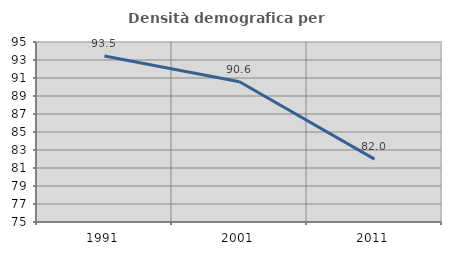
| Category | Densità demografica |
|---|---|
| 1991.0 | 93.455 |
| 2001.0 | 90.589 |
| 2011.0 | 81.992 |